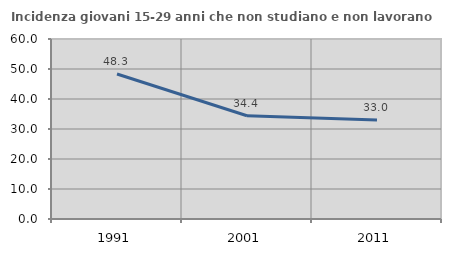
| Category | Incidenza giovani 15-29 anni che non studiano e non lavorano  |
|---|---|
| 1991.0 | 48.32 |
| 2001.0 | 34.421 |
| 2011.0 | 32.997 |